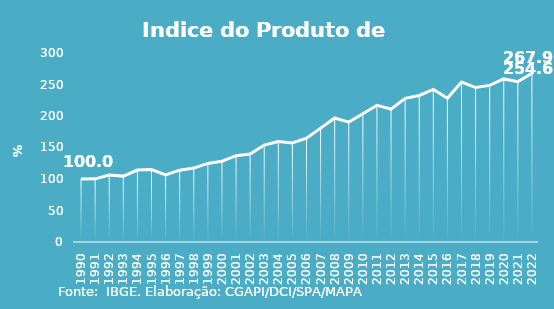
| Category | Indice de Prod. base 1990 |
|---|---|
| 1990.0 | 100 |
| 1991.0 | 100.275 |
| 1992.0 | 106.203 |
| 1993.0 | 104.57 |
| 1994.0 | 114.164 |
| 1995.0 | 115.024 |
| 1996.0 | 106.552 |
| 1997.0 | 114.037 |
| 1998.0 | 117.319 |
| 1999.0 | 124.734 |
| 2000.0 | 128.293 |
| 2001.0 | 136.975 |
| 2002.0 | 139.51 |
| 2003.0 | 153.868 |
| 2004.0 | 159.641 |
| 2005.0 | 157.136 |
| 2006.0 | 164.858 |
| 2007.0 | 180.781 |
| 2008.0 | 196.91 |
| 2009.0 | 190.309 |
| 2010.0 | 203.581 |
| 2011.0 | 217.041 |
| 2012.0 | 210.932 |
| 2013.0 | 228.009 |
| 2014.0 | 232.562 |
| 2015.0 | 242.318 |
| 2016.0 | 228.239 |
| 2017.0 | 253.826 |
| 2018.0 | 245.134 |
| 2019.0 | 248.619 |
| 2020.0 | 258.848 |
| 2021.0 | 254.577 |
| 2022.0 | 267.911 |